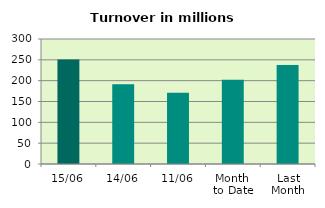
| Category | Series 0 |
|---|---|
| 15/06 | 250.897 |
| 14/06 | 191.698 |
| 11/06 | 171.204 |
| Month 
to Date | 202.207 |
| Last
Month | 237.894 |